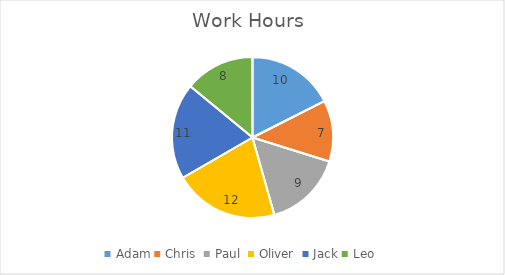
| Category | Work Hours  |
|---|---|
| Adam | 10 |
| Chris  | 7 |
| Paul  | 9 |
| Oliver  | 12 |
| Jack | 11 |
| Leo  | 8 |